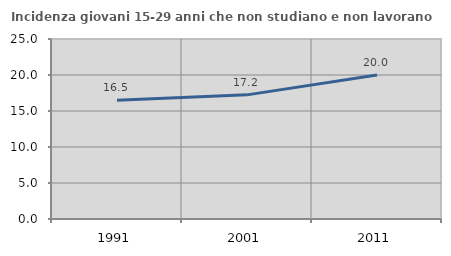
| Category | Incidenza giovani 15-29 anni che non studiano e non lavorano  |
|---|---|
| 1991.0 | 16.505 |
| 2001.0 | 17.241 |
| 2011.0 | 20 |